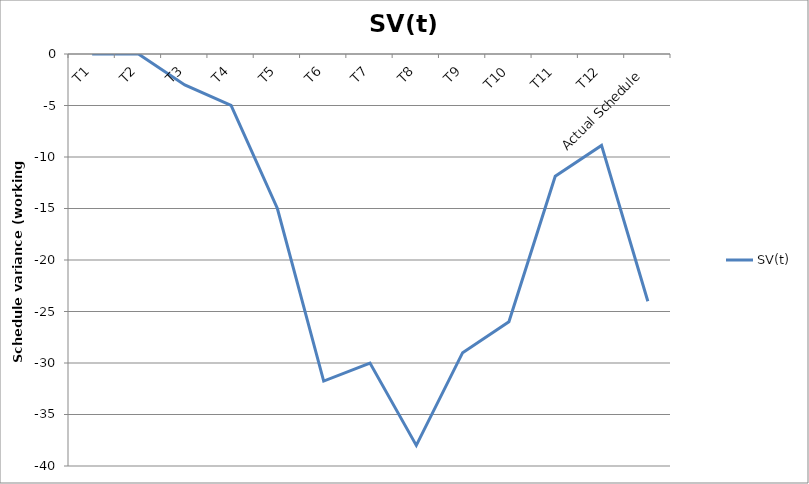
| Category | SV(t) |
|---|---|
| T1 | 0 |
| T2 | 0 |
| T3 | -3 |
| T4 | -5 |
| T5 | -15 |
| T6 | -31.75 |
| T7 | -30 |
| T8 | -38 |
| T9 | -29 |
| T10 | -26 |
| T11 | -11.875 |
| T12 | -8.875 |
| Actual Schedule | -24 |